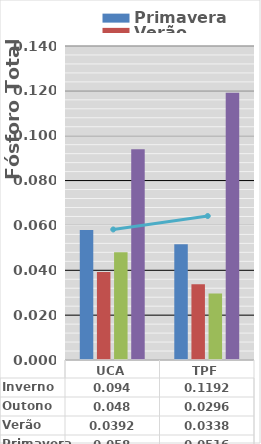
| Category | Primavera | Verão | Outono | Inverno |
|---|---|---|---|---|
| UCA | 0.058 | 0.039 | 0.048 | 0.094 |
| TPF | 0.052 | 0.034 | 0.03 | 0.119 |